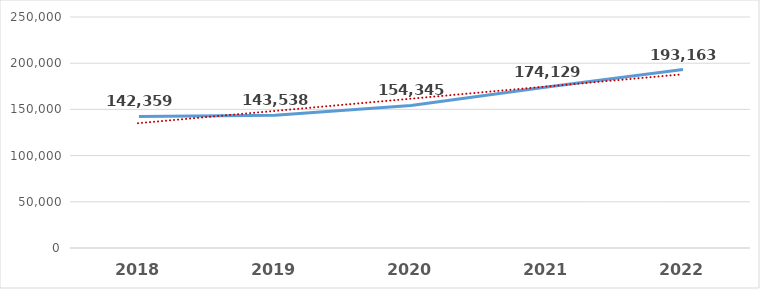
| Category | Series 0 |
|---|---|
| 2018.0 | 142359 |
| 2019.0 | 143538 |
| 2020.0 | 154345 |
| 2021.0 | 174129.189 |
| 2022.0 | 193163 |